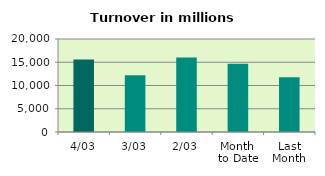
| Category | Series 0 |
|---|---|
| 4/03 | 15584.881 |
| 3/03 | 12181.929 |
| 2/03 | 15999.689 |
| Month 
to Date | 14691.659 |
| Last
Month | 11787.675 |